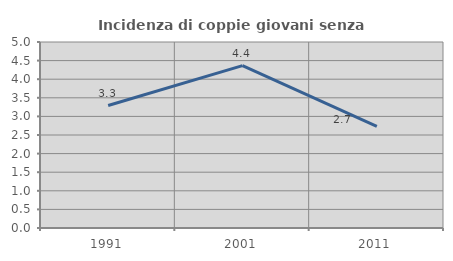
| Category | Incidenza di coppie giovani senza figli |
|---|---|
| 1991.0 | 3.292 |
| 2001.0 | 4.365 |
| 2011.0 | 2.734 |